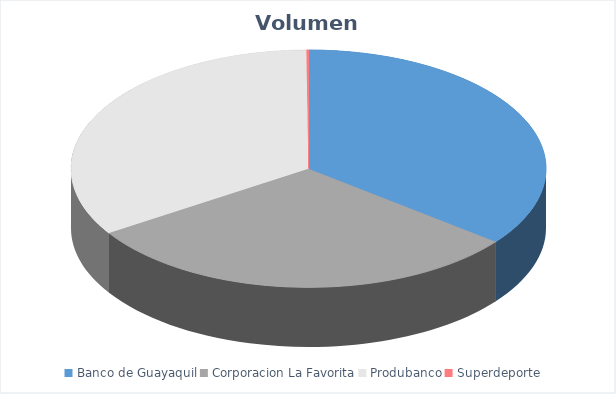
| Category | VOLUMEN ($USD) |
|---|---|
| Banco de Guayaquil | 38152.52 |
| Corporacion La Favorita | 32473.77 |
| Produbanco | 36448 |
| Superdeporte | 151.25 |